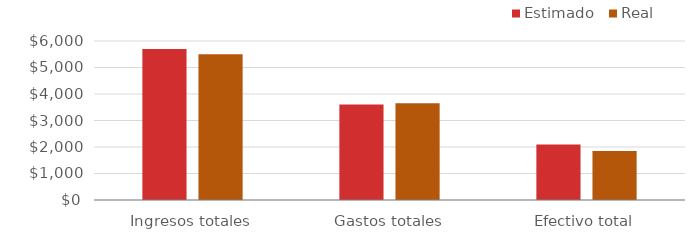
| Category | Estimado | Real |
|---|---|---|
| Ingresos totales | 5700 | 5500 |
| Gastos totales | 3603 | 3655 |
| Efectivo total | 2097 | 1845 |